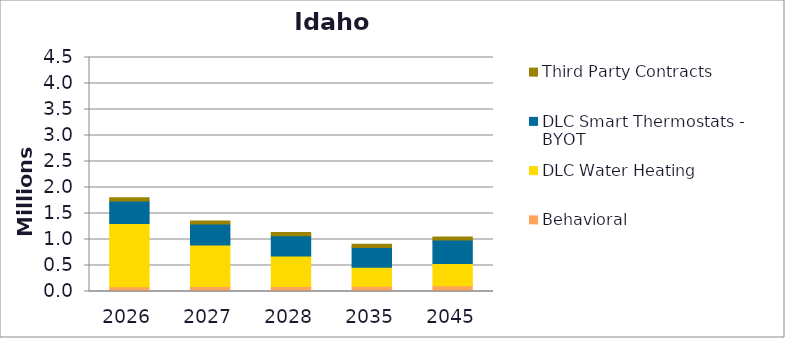
| Category | Behavioral | DLC Water Heating | DLC Smart Thermostats - BYOT | Third Party Contracts |
|---|---|---|---|---|
| 2026.0 | 0.092 | 1.217 | 0.432 | 0.061 |
| 2027.0 | 0.096 | 0.798 | 0.402 | 0.061 |
| 2028.0 | 0.097 | 0.587 | 0.39 | 0.061 |
| 2035.0 | 0.101 | 0.364 | 0.382 | 0.061 |
| 2045.0 | 0.109 | 0.429 | 0.45 | 0.061 |